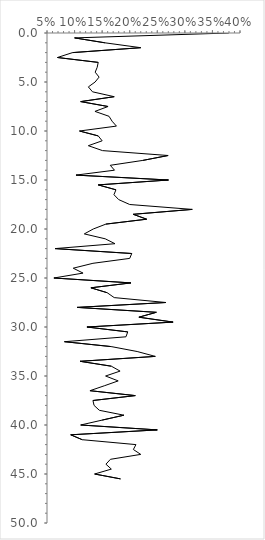
| Category | Series 0 |
|---|---|
| 0.37967914438502676 | 0 |
| 0.1 | 0.5 |
| 0.15503875968992248 | 1 |
| 0.22 | 1.5 |
| 0.0963855421686747 | 2 |
| 0.06896551724137931 | 2.5 |
| 0.14285714285714285 | 3 |
| 0.14102564102564102 | 3.5 |
| 0.13740458015267176 | 4 |
| 0.14444444444444443 | 4.5 |
| 0.13725490196078433 | 5 |
| 0.125 | 5.5 |
| 0.13253012048192772 | 6 |
| 0.171875 | 6.5 |
| 0.1111111111111111 | 7 |
| 0.16071428571428573 | 7.5 |
| 0.136986301369863 | 8 |
| 0.1625 | 8.5 |
| 0.168 | 9 |
| 0.17592592592592593 | 9.5 |
| 0.10891089108910891 | 10 |
| 0.14285714285714285 | 10.5 |
| 0.15 | 11 |
| 0.125 | 11.5 |
| 0.15060240963855423 | 12 |
| 0.2696629213483146 | 12.5 |
| 0.22388059701492538 | 13 |
| 0.16470588235294117 | 13.5 |
| 0.1724137931034483 | 14 |
| 0.10256410256410256 | 14.5 |
| 0.2702702702702703 | 15 |
| 0.14285714285714285 | 15.5 |
| 0.175 | 16 |
| 0.17142857142857143 | 16.5 |
| 0.18 | 17 |
| 0.2 | 17.5 |
| 0.31343283582089554 | 18 |
| 0.20634920634920634 | 18.5 |
| 0.23076923076923078 | 19 |
| 0.1568627450980392 | 19.5 |
| 0.13385826771653545 | 20 |
| 0.11764705882352941 | 20.5 |
| 0.15555555555555556 | 21 |
| 0.17333333333333334 | 21.5 |
| 0.06451612903225806 | 22 |
| 0.2037037037037037 | 22.5 |
| 0.2 | 23 |
| 0.13333333333333333 | 23.5 |
| 0.0975609756097561 | 24 |
| 0.11538461538461539 | 24.5 |
| 0.0625 | 25 |
| 0.20224719101123595 | 25.5 |
| 0.12962962962962962 | 26 |
| 0.1590909090909091 | 26.5 |
| 0.171875 | 27 |
| 0.265625 | 27.5 |
| 0.10476190476190476 | 28 |
| 0.2482758620689655 | 28.5 |
| 0.21666666666666667 | 29 |
| 0.2786885245901639 | 29.5 |
| 0.12244897959183673 | 30 |
| 0.19642857142857142 | 30.5 |
| 0.19318181818181818 | 31 |
| 0.08163265306122448 | 31.5 |
| 0.16666666666666666 | 32 |
| 0.21348314606741572 | 32.5 |
| 0.2463768115942029 | 33 |
| 0.11 | 33.5 |
| 0.16666666666666666 | 34 |
| 0.18253968253968253 | 34.5 |
| 0.15625 | 35 |
| 0.1791044776119403 | 35.5 |
| 0.15384615384615385 | 36 |
| 0.12790697674418605 | 36.5 |
| 0.21008403361344538 | 37 |
| 0.13333333333333333 | 37.5 |
| 0.13533834586466165 | 38 |
| 0.14492753623188406 | 38.5 |
| 0.18947368421052632 | 39 |
| 0.15 | 39.5 |
| 0.1111111111111111 | 40 |
| 0.25 | 40.5 |
| 0.09302325581395349 | 41 |
| 0.11382113821138211 | 41.5 |
| 0.2112676056338028 | 42 |
| 0.2066115702479339 | 42.5 |
| 0.22 | 43 |
| 0.1650485436893204 | 43.5 |
| 0.1568627450980392 | 44 |
| 0.16666666666666666 | 44.5 |
| 0.13636363636363635 | 45 |
| 0.18333333333333332 | 45.5 |